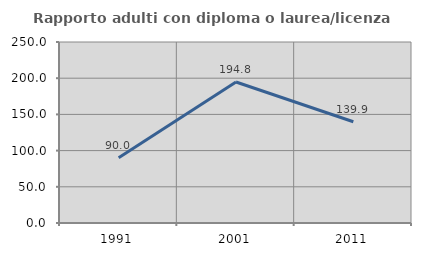
| Category | Rapporto adulti con diploma o laurea/licenza media  |
|---|---|
| 1991.0 | 89.966 |
| 2001.0 | 194.799 |
| 2011.0 | 139.894 |